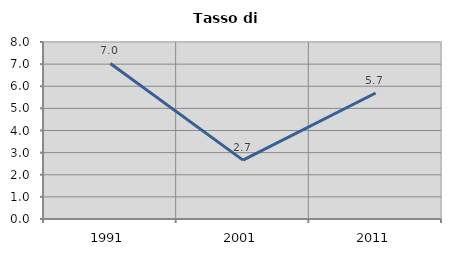
| Category | Tasso di disoccupazione   |
|---|---|
| 1991.0 | 7.031 |
| 2001.0 | 2.66 |
| 2011.0 | 5.694 |